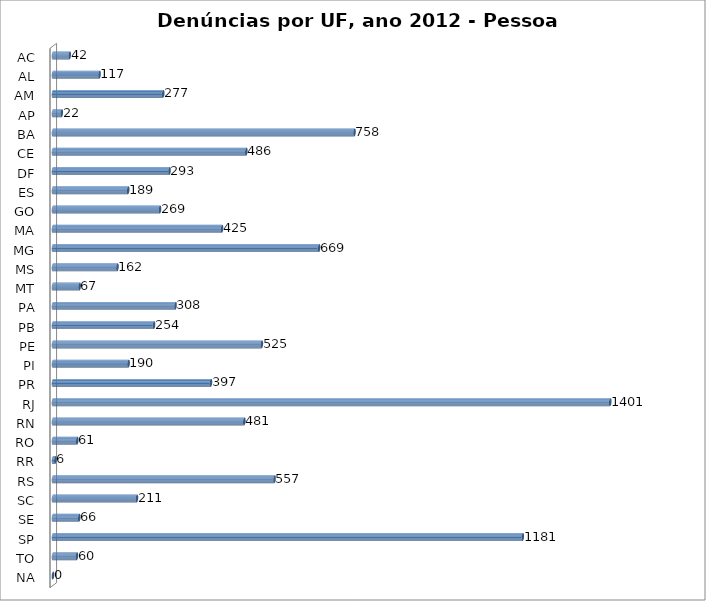
| Category | Series 0 |
|---|---|
| AC | 42 |
| AL | 117 |
| AM | 277 |
| AP | 22 |
| BA | 758 |
| CE | 486 |
| DF | 293 |
| ES | 189 |
| GO | 269 |
| MA | 425 |
| MG | 669 |
| MS | 162 |
| MT | 67 |
| PA | 308 |
| PB | 254 |
| PE | 525 |
| PI | 190 |
| PR | 397 |
| RJ | 1401 |
| RN | 481 |
| RO | 61 |
| RR | 6 |
| RS | 557 |
| SC | 211 |
| SE | 66 |
| SP | 1181 |
| TO | 60 |
| NA | 0 |